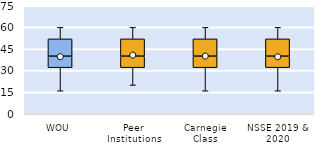
| Category | 25th | 50th | 75th |
|---|---|---|---|
| WOU | 32 | 8 | 12 |
| Peer Institutions | 32 | 8 | 12 |
| Carnegie Class | 32 | 8 | 12 |
| NSSE 2019 & 2020 | 32 | 8 | 12 |